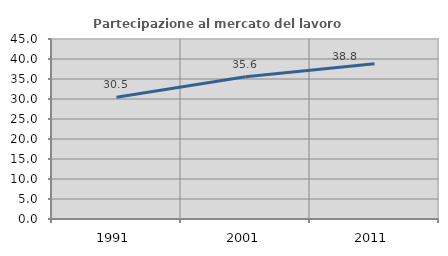
| Category | Partecipazione al mercato del lavoro  femminile |
|---|---|
| 1991.0 | 30.46 |
| 2001.0 | 35.572 |
| 2011.0 | 38.831 |